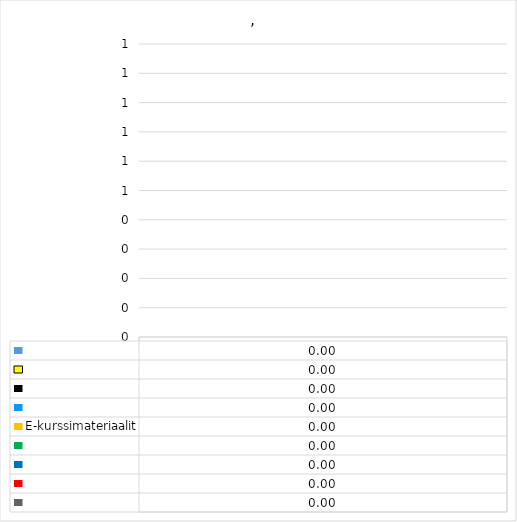
| Category | Series 0 | Series 1 | Series 2 | Series 3 | E-kurssimateriaalit | Series 5 | Series 6 | Series 7 | Series 8 |
|---|---|---|---|---|---|---|---|---|---|
| 0 | 0 | 0 | 0 | 0 | 0 | 0 | 0 | 0 | 0 |